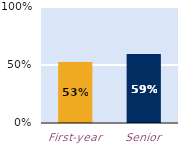
| Category | At least some |
|---|---|
| First-year | 0.527 |
| Senior | 0.595 |